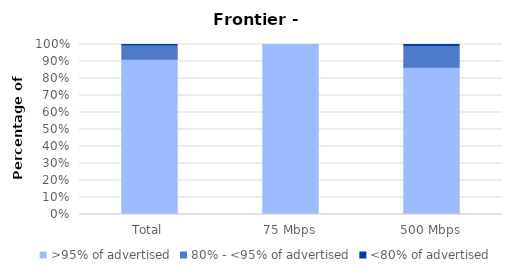
| Category | >95% of advertised | 80% - <95% of advertised | <80% of advertised |
|---|---|---|---|
| Total | 0.913 | 0.077 | 0.01 |
| 75 Mbps | 1 | 0 | 0 |
| 500 Mbps | 0.866 | 0.119 | 0.015 |